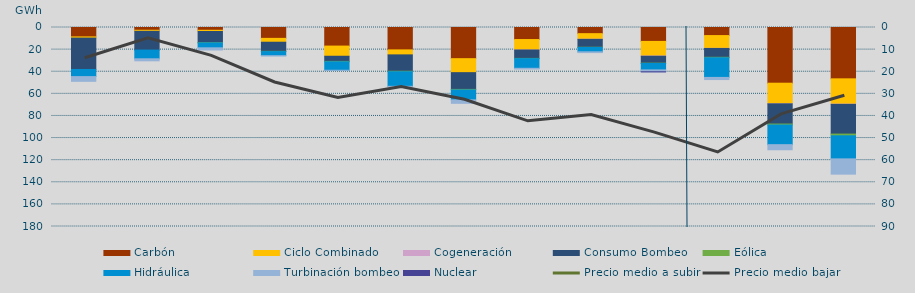
| Category | Carbón | Ciclo Combinado | Cogeneración | Consumo Bombeo | Eólica | Hidráulica | Turbinación bombeo | Nuclear |
|---|---|---|---|---|---|---|---|---|
| 0 | 8482.9 | 1097 | 0 | 28368.3 | 0 | 6471.7 | 4284.6 | 0 |
| 1 | 2481.2 | 973 | 0 | 16964.8 | 0 | 7876.1 | 1848.7 | 0 |
| 2 | 2502.1 | 1126 | 0 | 10105.8 | 176.9 | 4467.7 | 1975.3 | 0 |
| 3 | 9826.3 | 3497.3 | 0 | 8231.5 | 242 | 3677.4 | 129.8 | 0 |
| 4 | 16804.9 | 9200.1 | 0 | 4654.1 | 369.5 | 7625.8 | 107.2 | 0 |
| 5 | 20254.1 | 4502.5 | 0 | 14825.7 | 422.9 | 13215.2 | 462.9 | 0 |
| 6 | 28176.4 | 12664.3 | 0 | 15166.3 | 462.1 | 8996.5 | 3124.7 | 0 |
| 7 | 10892.6 | 9459.3 | 19 | 7585 | 201.8 | 8745.3 | 691.6 | 0 |
| 8 | 5563.5 | 5060.2 | 113 | 7129.2 | 169.4 | 3964.2 | 709 | 0 |
| 9 | 12581.1 | 13203.9 | 233 | 6261.8 | 220.5 | 5846.4 | 1688.7 | 125 |
| 10 | 7306.9 | 11559.1 | 88 | 7999 | 402.8 | 17797.7 | 1941.3 | 0 |
| 11 | 50376 | 18600.8 | 92.8 | 18257.2 | 867.9 | 17793.5 | 4596.7 | 0 |
| 12 | 46429 | 22875.8 | 230 | 26858.5 | 1566 | 20878.9 | 13810.2 | 0 |